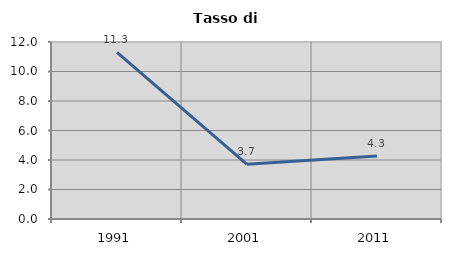
| Category | Tasso di disoccupazione   |
|---|---|
| 1991.0 | 11.29 |
| 2001.0 | 3.704 |
| 2011.0 | 4.268 |